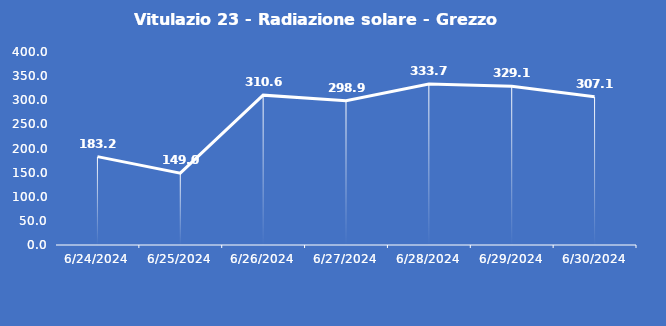
| Category | Vitulazio 23 - Radiazione solare - Grezzo (W/m2) |
|---|---|
| 6/24/24 | 183.2 |
| 6/25/24 | 149 |
| 6/26/24 | 310.6 |
| 6/27/24 | 298.9 |
| 6/28/24 | 333.7 |
| 6/29/24 | 329.1 |
| 6/30/24 | 307.1 |